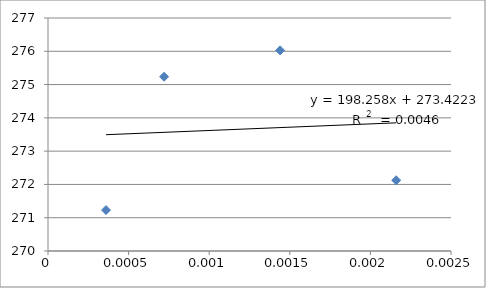
| Category | Series 0 |
|---|---|
| 0.00036 | 271.23 |
| 0.00072 | 275.235 |
| 0.00144 | 276.027 |
| 0.00216 | 272.125 |